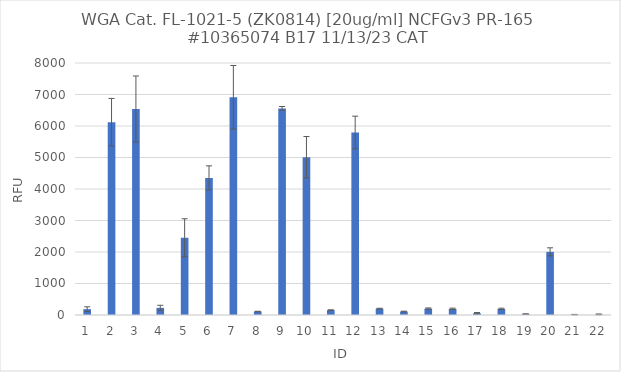
| Category | RFU |
|---|---|
| 0 | 185.75 |
| 1 | 6122.25 |
| 2 | 6538.75 |
| 3 | 226 |
| 4 | 2452 |
| 5 | 4352 |
| 6 | 6909 |
| 7 | 109 |
| 8 | 6559 |
| 9 | 5009.5 |
| 10 | 155.25 |
| 11 | 5795.5 |
| 12 | 200.75 |
| 13 | 108.75 |
| 14 | 203.75 |
| 15 | 195.25 |
| 16 | 57.5 |
| 17 | 193.75 |
| 18 | 32.25 |
| 19 | 2004 |
| 20 | 11.5 |
| 21 | 19.5 |